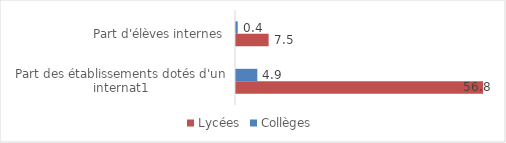
| Category | Lycées | Collèges |
|---|---|---|
| Part des établissements dotés d'un internat1 | 56.8 | 4.9 |
| Part d'élèves internes | 7.5 | 0.4 |